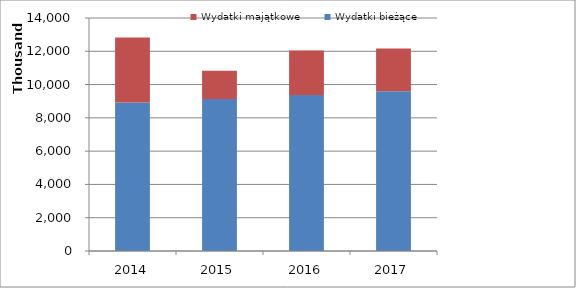
| Category | Wydatki bieżące | Wydatki majątkowe |
|---|---|---|
| 2014.0 | 8917188.81 | 3910500 |
| 2015.0 | 9140000 | 1685000 |
| 2016.0 | 9368000 | 2682000 |
| 2017.0 | 9600000 | 2570000 |